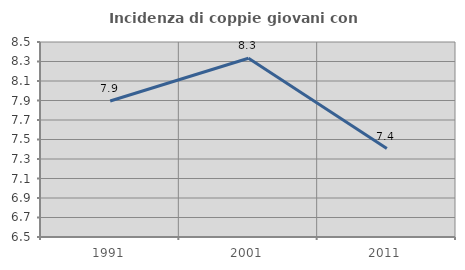
| Category | Incidenza di coppie giovani con figli |
|---|---|
| 1991.0 | 7.895 |
| 2001.0 | 8.333 |
| 2011.0 | 7.407 |